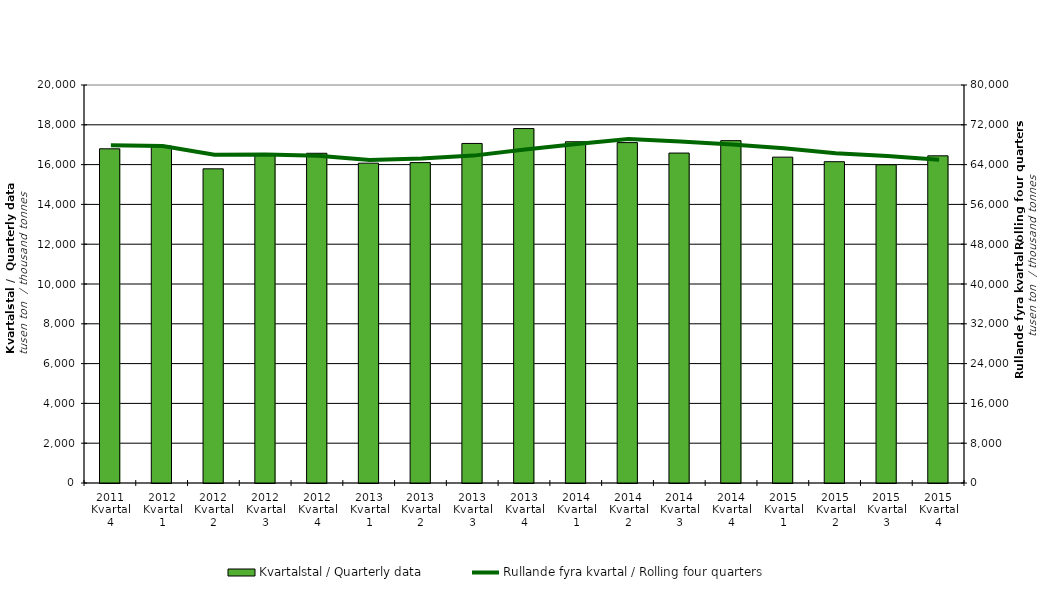
| Category | Kvartalstal / Quarterly data |
|---|---|
| 2011 Kvartal 4 | 16793.814 |
| 2012 Kvartal 1 | 16927.735 |
| 2012 Kvartal 2 | 15787.924 |
| 2012 Kvartal 3 | 16503.474 |
| 2012 Kvartal 4 | 16569.563 |
| 2013 Kvartal 1 | 16072.217 |
| 2013 Kvartal 2 | 16100.045 |
| 2013 Kvartal 3 | 17062.958 |
| 2013 Kvartal 4 | 17811.357 |
| 2014 Kvartal 1 | 17146.805 |
| 2014 Kvartal 2 | 17105.179 |
| 2014 Kvartal 3 | 16579.663 |
| 2014 Kvartal 4 | 17203.242 |
| 2015 Kvartal 1 | 16374.41 |
| 2015 Kvartal 2 | 16146.203 |
| 2015 Kvartal 3 | 15992.332 |
| 2015 Kvartal 4 | 16441.481 |